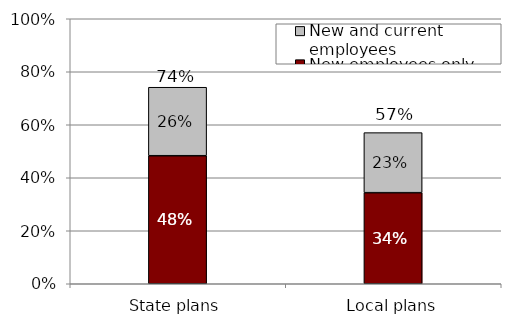
| Category | New employees only | New and current employees |
|---|---|---|
| State plans | 0.483 | 0.258 |
| Local plans | 0.344 | 0.227 |